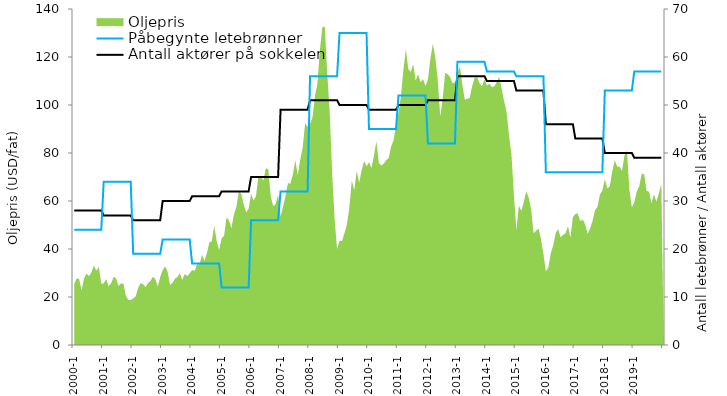
| Category | Antall aktører på sokkelen | Påbegynte letebrønner |
|---|---|---|
| 2000-1 | 28 | 24 |
| 2000-2 | 28 | 24 |
| 2000-3 | 28 | 24 |
| 2000-4 | 28 | 24 |
| 2000-5 | 28 | 24 |
| 2000-6 | 28 | 24 |
| 2000-7 | 28 | 24 |
| 2000-8 | 28 | 24 |
| 2000-9 | 28 | 24 |
| 2000-10 | 28 | 24 |
| 2000-11 | 28 | 24 |
| 2000-12 | 28 | 24 |
| 2001-1 | 27 | 34 |
| 2001-2 | 27 | 34 |
| 2001-3 | 27 | 34 |
| 2001-4 | 27 | 34 |
| 2001-5 | 27 | 34 |
| 2001-6 | 27 | 34 |
| 2001-7 | 27 | 34 |
| 2001-8 | 27 | 34 |
| 2001-9 | 27 | 34 |
| 2001-10 | 27 | 34 |
| 2001-11 | 27 | 34 |
| 2001-12 | 27 | 34 |
| 2002-1 | 26 | 19 |
| 2002-2 | 26 | 19 |
| 2002-3 | 26 | 19 |
| 2002-4 | 26 | 19 |
| 2002-5 | 26 | 19 |
| 2002-6 | 26 | 19 |
| 2002-7 | 26 | 19 |
| 2002-8 | 26 | 19 |
| 2002-9 | 26 | 19 |
| 2002-10 | 26 | 19 |
| 2002-11 | 26 | 19 |
| 2002-12 | 26 | 19 |
| 2003-1 | 30 | 22 |
| 2003-2 | 30 | 22 |
| 2003-3 | 30 | 22 |
| 2003-4 | 30 | 22 |
| 2003-5 | 30 | 22 |
| 2003-6 | 30 | 22 |
| 2003-7 | 30 | 22 |
| 2003-8 | 30 | 22 |
| 2003-9 | 30 | 22 |
| 2003-10 | 30 | 22 |
| 2003-11 | 30 | 22 |
| 2003-12 | 30 | 22 |
| 2004-1 | 31 | 17 |
| 2004-2 | 31 | 17 |
| 2004-3 | 31 | 17 |
| 2004-4 | 31 | 17 |
| 2004-5 | 31 | 17 |
| 2004-6 | 31 | 17 |
| 2004-7 | 31 | 17 |
| 2004-8 | 31 | 17 |
| 2004-9 | 31 | 17 |
| 2004-10 | 31 | 17 |
| 2004-11 | 31 | 17 |
| 2004-12 | 31 | 17 |
| 2005-1 | 32 | 12 |
| 2005-2 | 32 | 12 |
| 2005-3 | 32 | 12 |
| 2005-4 | 32 | 12 |
| 2005-5 | 32 | 12 |
| 2005-6 | 32 | 12 |
| 2005-7 | 32 | 12 |
| 2005-8 | 32 | 12 |
| 2005-9 | 32 | 12 |
| 2005-10 | 32 | 12 |
| 2005-11 | 32 | 12 |
| 2005-12 | 32 | 12 |
| 2006-1 | 35 | 26 |
| 2006-2 | 35 | 26 |
| 2006-3 | 35 | 26 |
| 2006-4 | 35 | 26 |
| 2006-5 | 35 | 26 |
| 2006-6 | 35 | 26 |
| 2006-7 | 35 | 26 |
| 2006-8 | 35 | 26 |
| 2006-9 | 35 | 26 |
| 2006-10 | 35 | 26 |
| 2006-11 | 35 | 26 |
| 2006-12 | 35 | 26 |
| 2007-1 | 49 | 32 |
| 2007-2 | 49 | 32 |
| 2007-3 | 49 | 32 |
| 2007-4 | 49 | 32 |
| 2007-5 | 49 | 32 |
| 2007-6 | 49 | 32 |
| 2007-7 | 49 | 32 |
| 2007-8 | 49 | 32 |
| 2007-9 | 49 | 32 |
| 2007-10 | 49 | 32 |
| 2007-11 | 49 | 32 |
| 2007-12 | 49 | 32 |
| 2008-1 | 51 | 56 |
| 2008-2 | 51 | 56 |
| 2008-3 | 51 | 56 |
| 2008-4 | 51 | 56 |
| 2008-5 | 51 | 56 |
| 2008-6 | 51 | 56 |
| 2008-7 | 51 | 56 |
| 2008-8 | 51 | 56 |
| 2008-9 | 51 | 56 |
| 2008-10 | 51 | 56 |
| 2008-11 | 51 | 56 |
| 2008-12 | 51 | 56 |
| 2009-1 | 50 | 65 |
| 2009-2 | 50 | 65 |
| 2009-3 | 50 | 65 |
| 2009-4 | 50 | 65 |
| 2009-5 | 50 | 65 |
| 2009-6 | 50 | 65 |
| 2009-7 | 50 | 65 |
| 2009-8 | 50 | 65 |
| 2009-9 | 50 | 65 |
| 2009-10 | 50 | 65 |
| 2009-11 | 50 | 65 |
| 2009-12 | 50 | 65 |
| 2010-1 | 49 | 45 |
| 2010-2 | 49 | 45 |
| 2010-3 | 49 | 45 |
| 2010-4 | 49 | 45 |
| 2010-5 | 49 | 45 |
| 2010-6 | 49 | 45 |
| 2010-7 | 49 | 45 |
| 2010-8 | 49 | 45 |
| 2010-9 | 49 | 45 |
| 2010-10 | 49 | 45 |
| 2010-11 | 49 | 45 |
| 2010-12 | 49 | 45 |
| 2011-1 | 50 | 52 |
| 2011-2 | 50 | 52 |
| 2011-3 | 50 | 52 |
| 2011-4 | 50 | 52 |
| 2011-5 | 50 | 52 |
| 2011-6 | 50 | 52 |
| 2011-7 | 50 | 52 |
| 2011-8 | 50 | 52 |
| 2011-9 | 50 | 52 |
| 2011-10 | 50 | 52 |
| 2011-11 | 50 | 52 |
| 2011-12 | 50 | 52 |
| 2012-1 | 51 | 42 |
| 2012-2 | 51 | 42 |
| 2012-3 | 51 | 42 |
| 2012-4 | 51 | 42 |
| 2012-5 | 51 | 42 |
| 2012-6 | 51 | 42 |
| 2012-7 | 51 | 42 |
| 2012-8 | 51 | 42 |
| 2012-9 | 51 | 42 |
| 2012-10 | 51 | 42 |
| 2012-11 | 51 | 42 |
| 2012-12 | 51 | 42 |
| 2013-1 | 56 | 59 |
| 2013-2 | 56 | 59 |
| 2013-3 | 56 | 59 |
| 2013-4 | 56 | 59 |
| 2013-5 | 56 | 59 |
| 2013-6 | 56 | 59 |
| 2013-7 | 56 | 59 |
| 2013-8 | 56 | 59 |
| 2013-9 | 56 | 59 |
| 2013-10 | 56 | 59 |
| 2013-11 | 56 | 59 |
| 2013-12 | 56 | 59 |
| 2014-1 | 55 | 57 |
| 2014-2 | 55 | 57 |
| 2014-3 | 55 | 57 |
| 2014-4 | 55 | 57 |
| 2014-5 | 55 | 57 |
| 2014-6 | 55 | 57 |
| 2014-7 | 55 | 57 |
| 2014-8 | 55 | 57 |
| 2014-9 | 55 | 57 |
| 2014-10 | 55 | 57 |
| 2014-11 | 55 | 57 |
| 2014-12 | 55 | 57 |
| 2015-1 | 53 | 56 |
| 2015-2 | 53 | 56 |
| 2015-3 | 53 | 56 |
| 2015-4 | 53 | 56 |
| 2015-5 | 53 | 56 |
| 2015-6 | 53 | 56 |
| 2015-7 | 53 | 56 |
| 2015-8 | 53 | 56 |
| 2015-9 | 53 | 56 |
| 2015-10 | 53 | 56 |
| 2015-11 | 53 | 56 |
| 2015-12 | 53 | 56 |
| 2016-1 | 46 | 36 |
| 2016-2 | 46 | 36 |
| 2016-3 | 46 | 36 |
| 2016-4 | 46 | 36 |
| 2016-5 | 46 | 36 |
| 2016-6 | 46 | 36 |
| 2016-7 | 46 | 36 |
| 2016-8 | 46 | 36 |
| 2016-9 | 46 | 36 |
| 2016-10 | 46 | 36 |
| 2016-11 | 46 | 36 |
| 2016-12 | 46 | 36 |
| 2017-1 | 43 | 36 |
| 2017-2 | 43 | 36 |
| 2017-3 | 43 | 36 |
| 2017-4 | 43 | 36 |
| 2017-5 | 43 | 36 |
| 2017-6 | 43 | 36 |
| 2017-7 | 43 | 36 |
| 2017-8 | 43 | 36 |
| 2017-9 | 43 | 36 |
| 2017-10 | 43 | 36 |
| 2017-11 | 43 | 36 |
| 2017-12 | 43 | 36 |
| 2018-1 | 40 | 53 |
| 2018-2 | 40 | 53 |
| 2018-3 | 40 | 53 |
| 2018-4 | 40 | 53 |
| 2018-5 | 40 | 53 |
| 2018-6 | 40 | 53 |
| 2018-7 | 40 | 53 |
| 2018-8 | 40 | 53 |
| 2018-9 | 40 | 53 |
| 2018-10 | 40 | 53 |
| 2018-11 | 40 | 53 |
| 2018-12 | 40 | 53 |
| 2019-1 | 39 | 57 |
| 2019-2 | 39 | 57 |
| 2019-3 | 39 | 57 |
| 2019-4 | 39 | 57 |
| 2019-5 | 39 | 57 |
| 2019-6 | 39 | 57 |
| 2019-7 | 39 | 57 |
| 2019-8 | 39 | 57 |
| 2019-9 | 39 | 57 |
| 2019-10 | 39 | 57 |
| 2019-11 | 39 | 57 |
| 2019-12 | 39 | 57 |